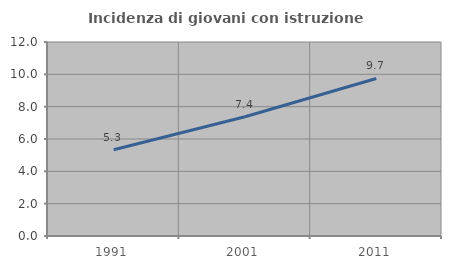
| Category | Incidenza di giovani con istruzione universitaria |
|---|---|
| 1991.0 | 5.333 |
| 2001.0 | 7.373 |
| 2011.0 | 9.744 |